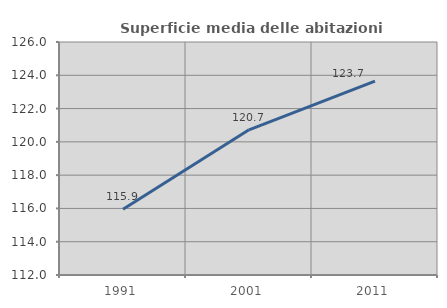
| Category | Superficie media delle abitazioni occupate |
|---|---|
| 1991.0 | 115.944 |
| 2001.0 | 120.725 |
| 2011.0 | 123.654 |